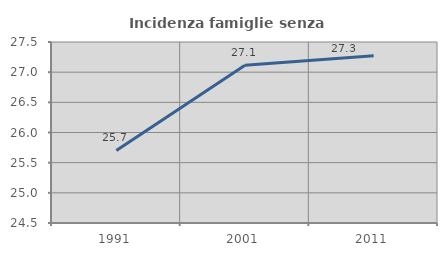
| Category | Incidenza famiglie senza nuclei |
|---|---|
| 1991.0 | 25.703 |
| 2001.0 | 27.116 |
| 2011.0 | 27.273 |